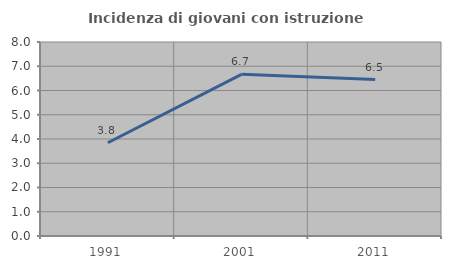
| Category | Incidenza di giovani con istruzione universitaria |
|---|---|
| 1991.0 | 3.846 |
| 2001.0 | 6.667 |
| 2011.0 | 6.452 |